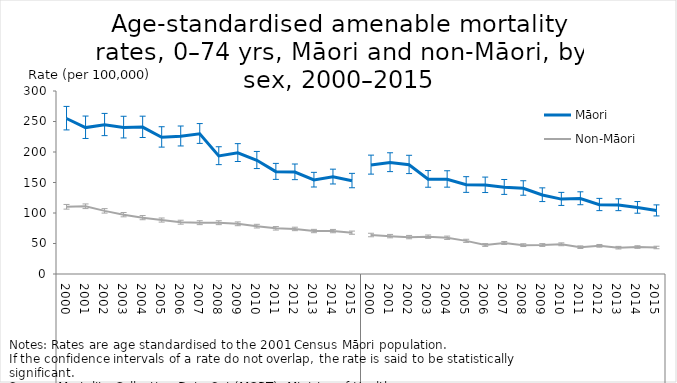
| Category | Māori | Non-Māori |
|---|---|---|
| 0 | 254.923 | 110.128 |
| 1 | 240.025 | 110.991 |
| 2 | 244.539 | 103.471 |
| 3 | 240.316 | 97.21 |
| 4 | 240.789 | 92.352 |
| 5 | 224.243 | 88.401 |
| 6 | 225.807 | 84.874 |
| 7 | 229.914 | 84.084 |
| 8 | 193.543 | 84.043 |
| 9 | 198.656 | 82.238 |
| 10 | 186.5 | 78.393 |
| 11 | 167.811 | 74.864 |
| 12 | 167.131 | 73.83 |
| 13 | 154.274 | 70.403 |
| 14 | 159.375 | 70.313 |
| 15 | 152.84 | 67.706 |
| 16 | 178.781 | 63.874 |
| 17 | 182.808 | 62.065 |
| 18 | 179.139 | 60.438 |
| 19 | 155.458 | 61.154 |
| 20 | 155.371 | 59.339 |
| 21 | 146.274 | 54.327 |
| 22 | 145.806 | 47.521 |
| 23 | 142.315 | 50.848 |
| 24 | 140.635 | 47.256 |
| 25 | 129.617 | 47.497 |
| 26 | 122.758 | 48.655 |
| 27 | 123.822 | 43.94 |
| 28 | 113.603 | 46.136 |
| 29 | 113.259 | 43.102 |
| 30 | 108.9 | 44.156 |
| 31 | 103.952 | 43.417 |